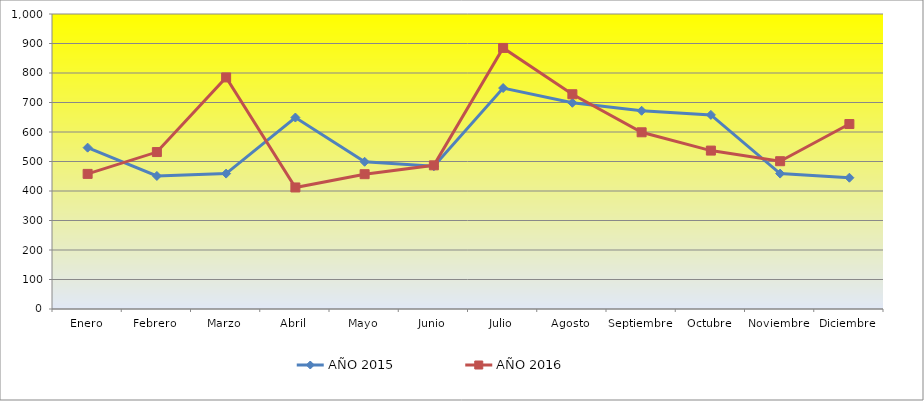
| Category | AÑO 2015 | AÑO 2016 |
|---|---|---|
| Enero | 547 | 458 |
| Febrero | 451 | 532 |
| Marzo | 459 | 785 |
| Abril | 649 | 412 |
| Mayo | 499 | 457 |
| Junio | 484 | 487 |
| Julio | 749 | 885 |
| Agosto | 699 | 728 |
| Septiembre | 672 | 599 |
| Octubre | 658 | 537 |
| Noviembre | 459 | 501 |
| Diciembre | 445 | 627 |